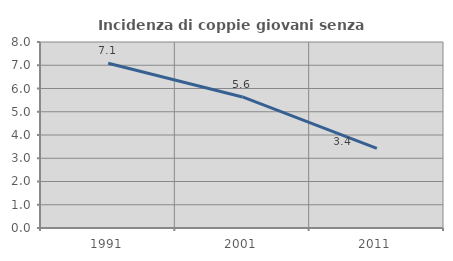
| Category | Incidenza di coppie giovani senza figli |
|---|---|
| 1991.0 | 7.086 |
| 2001.0 | 5.638 |
| 2011.0 | 3.421 |